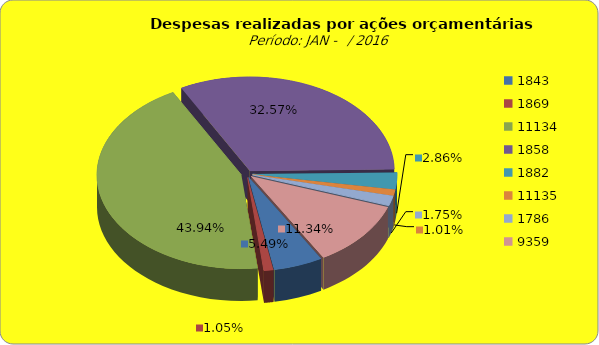
| Category | Series 1 |
|---|---|
| 1843.0 | 1915197.85 |
| 1869.0 | 367017.41 |
| 11134.0 | 15338686.07 |
| 1858.0 | 11368746.04 |
| 1882.0 | 997041.6 |
| 11135.0 | 351448 |
| 1786.0 | 609119.31 |
| 9359.0 | 3958856.27 |